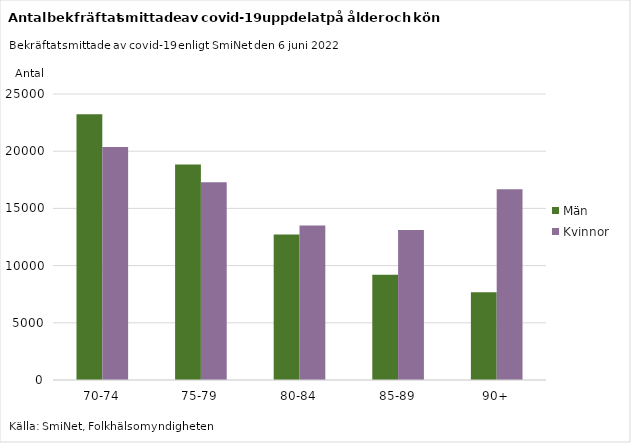
| Category | Män | Kvinnor |
|---|---|---|
| 70-74 | 23230 | 20366 |
| 75-79 | 18840 | 17291 |
| 80-84 | 12715 | 13515 |
| 85-89 | 9208 | 13103 |
| 90+ | 7667 | 16678 |